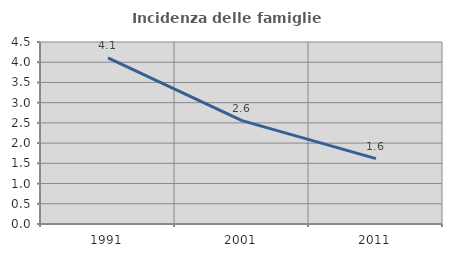
| Category | Incidenza delle famiglie numerose |
|---|---|
| 1991.0 | 4.106 |
| 2001.0 | 2.555 |
| 2011.0 | 1.618 |